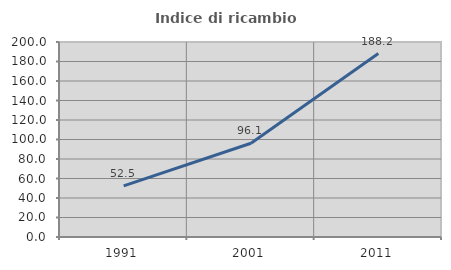
| Category | Indice di ricambio occupazionale  |
|---|---|
| 1991.0 | 52.508 |
| 2001.0 | 96.112 |
| 2011.0 | 188.204 |